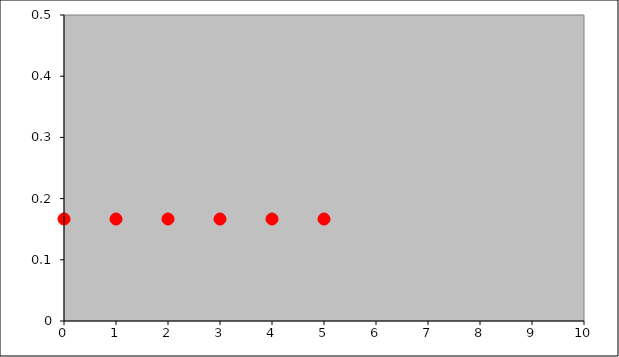
| Category | Series 0 |
|---|---|
| 0.0 | 0.167 |
| 1.0 | 0.167 |
| 2.0 | 0.167 |
| 3.0 | 0.167 |
| 4.0 | 0.167 |
| 5.0 | 0.167 |